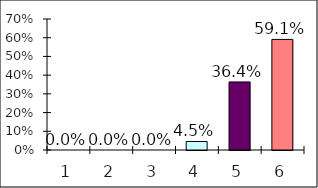
| Category | Series 0 |
|---|---|
| 0 | 0 |
| 1 | 0 |
| 2 | 0 |
| 3 | 0.045 |
| 4 | 0.364 |
| 5 | 0.591 |